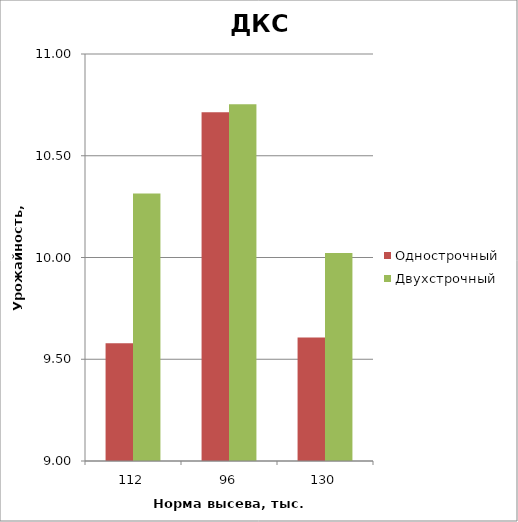
| Category | Однострочный | Двухстрочный |
|---|---|---|
| 112.0 | 9.579 | 10.315 |
| 96.0 | 10.713 | 10.753 |
| 130.0 | 9.607 | 10.022 |